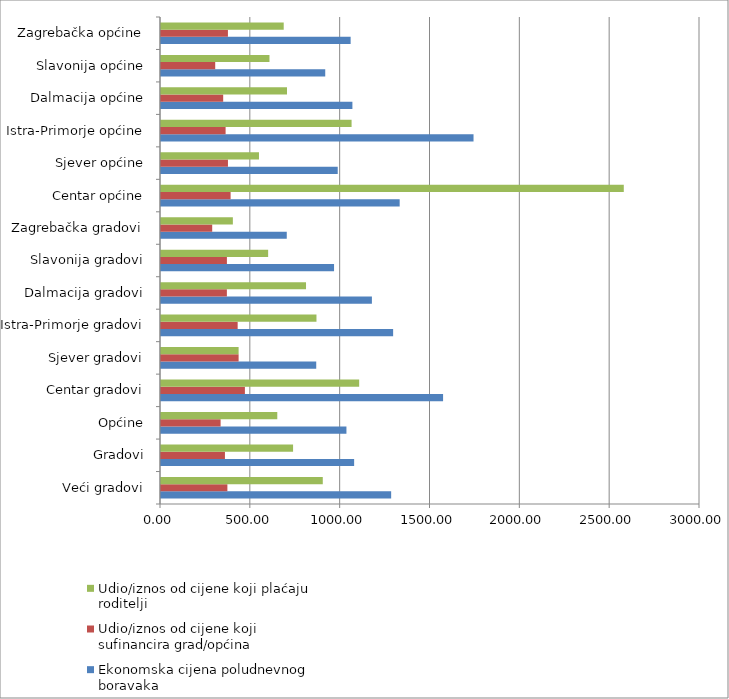
| Category | Ekonomska cijena poludnevnog boravaka | Udio/iznos od cijene koji sufinancira grad/općina | Udio/iznos od cijene koji plaćaju roditelji |
|---|---|---|---|
| Veći gradovi | 1281 | 369.5 | 900.444 |
| Gradovi | 1074.965 | 355.887 | 735.103 |
| Općine | 1032.103 | 331.778 | 647.207 |
| Centar gradovi | 1570 | 467 | 1103 |
| Sjever gradovi | 864 | 432 | 432 |
| Istra-Primorje gradovi | 1292 | 426.667 | 865.333 |
| Dalmacija gradovi | 1173.833 | 366.667 | 807.167 |
| Slavonija gradovi | 963.167 | 366.833 | 596.333 |
| Zagrebačka gradovi | 700 | 285 | 400 |
| Centar općine | 1328.429 | 387.429 | 2575.833 |
| Sjever općine | 983.621 | 372.686 | 545.333 |
| Istra-Primorje općine | 1739.5 | 359.571 | 1060.75 |
| Dalmacija općine | 1065.31 | 346.143 | 701.3 |
| Slavonija općine | 914.143 | 301.75 | 603.75 |
| Zagrebačka općine | 1055.5 | 372.5 | 683 |